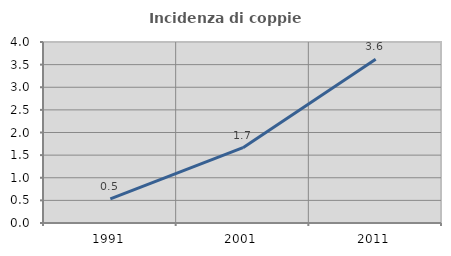
| Category | Incidenza di coppie miste |
|---|---|
| 1991.0 | 0.533 |
| 2001.0 | 1.665 |
| 2011.0 | 3.619 |